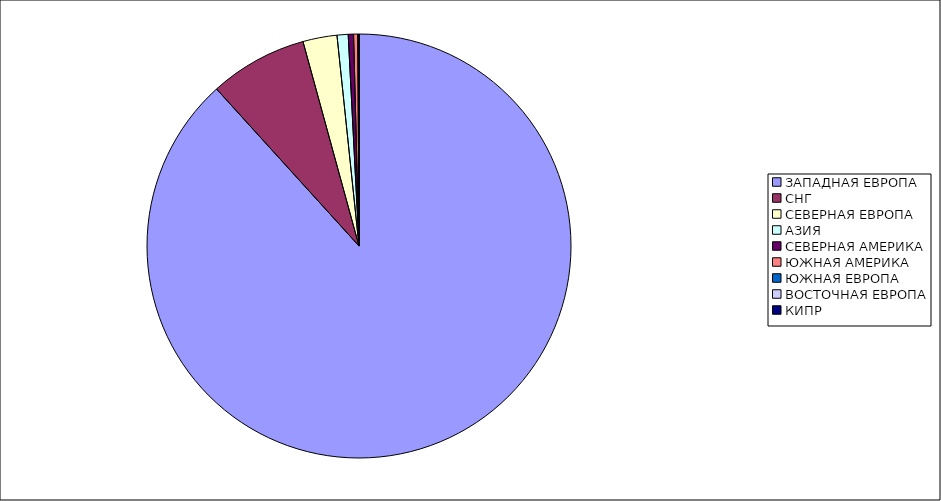
| Category | Оборот |
|---|---|
| ЗАПАДНАЯ ЕВРОПА | 0.883 |
| СНГ | 0.075 |
| СЕВЕРНАЯ ЕВРОПА | 0.026 |
| АЗИЯ | 0.008 |
| СЕВЕРНАЯ АМЕРИКА | 0.004 |
| ЮЖНАЯ АМЕРИКА | 0.003 |
| ЮЖНАЯ ЕВРОПА | 0.001 |
| ВОСТОЧНАЯ ЕВРОПА | 0 |
| КИПР | 0 |